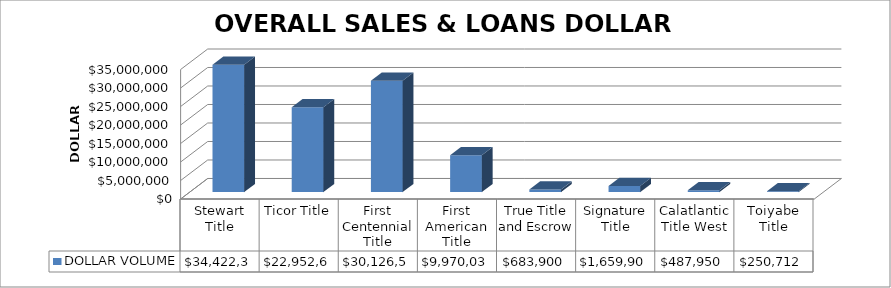
| Category | DOLLAR VOLUME |
|---|---|
| Stewart Title | 34422306 |
| Ticor Title | 22952620 |
| First Centennial Title | 30126547 |
| First American Title | 9970035.42 |
| True Title and Escrow | 683900 |
| Signature Title | 1659900 |
| Calatlantic Title West | 487950 |
| Toiyabe Title | 250712 |